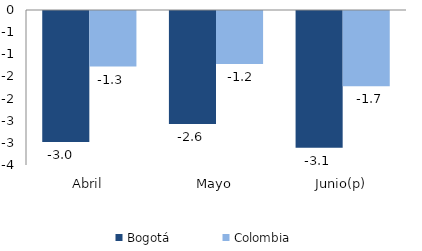
| Category | Bogotá | Colombia |
|---|---|---|
| Abril | -2.96 | -1.254 |
| Mayo | -2.554 | -1.197 |
| Junio(p) | -3.09 | -1.697 |